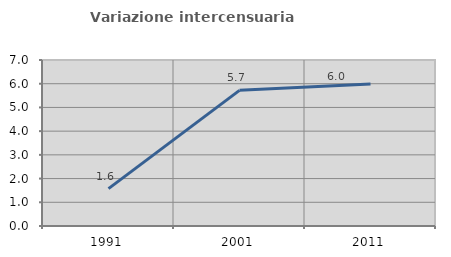
| Category | Variazione intercensuaria annua |
|---|---|
| 1991.0 | 1.575 |
| 2001.0 | 5.721 |
| 2011.0 | 5.993 |